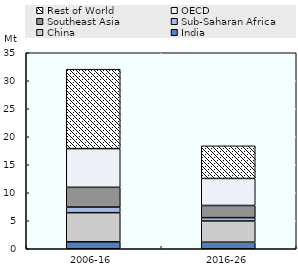
| Category | India | China | Sub-Saharan Africa | Southeast Asia | OECD | Rest of World |
|---|---|---|---|---|---|---|
| 2006-16 | 1.242 | 5.203 | 0.997 | 3.531 | 6.91 | 14.185 |
| 2016-26 | 1.173 | 3.79 | 0.595 | 2.169 | 4.829 | 5.823 |